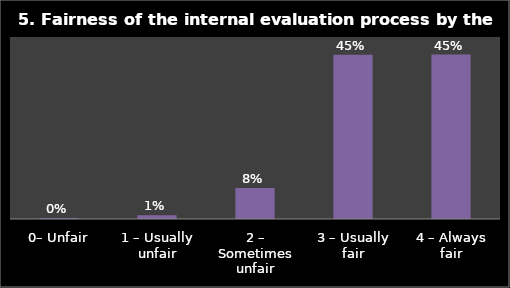
| Category | Series 0 |
|---|---|
| 0– Unfair | 0.003 |
| 1 – Usually unfair | 0.011 |
| 2 – Sometimes unfair | 0.085 |
| 3 – Usually fair | 0.451 |
| 4 – Always fair | 0.452 |